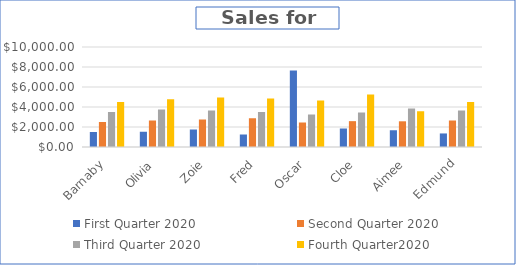
| Category | First Quarter 2020 | Second Quarter 2020 | Third Quarter 2020 | Fourth Quarter2020 |
|---|---|---|---|---|
| Barnaby | 1500 | 2500 | 3500 | 4500 |
| Olivia | 1525 | 2650 | 3750 | 4775 |
| Zoie | 1750 | 2750 | 3650 | 4950 |
| Fred | 1250 | 2875 | 3500 | 4850 |
| Oscar | 7650 | 2450 | 3250 | 4650 |
| Cloe | 1850 | 2585 | 3450 | 5250 |
| Aimee | 1675 | 2570 | 3850 | 3575 |
| Edmund | 1355 | 2650 | 3650 | 4500 |